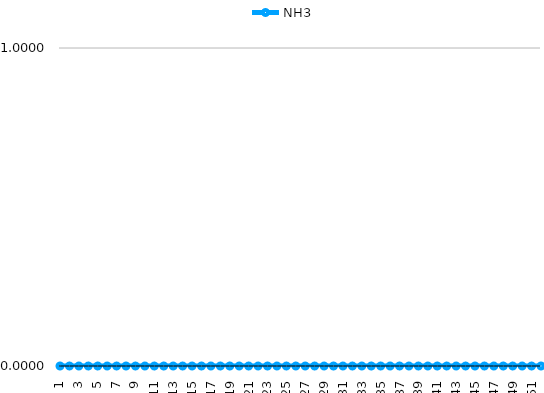
| Category | NH3 |
|---|---|
| 1 | 0 |
| 2 | 0 |
| 3 | 0 |
| 4 | 0 |
| 5 | 0 |
| 6 | 0 |
| 7 | 0 |
| 8 | 0 |
| 9 | 0 |
| 10 | 0 |
| 11 | 0 |
| 12 | 0 |
| 13 | 0 |
| 14 | 0 |
| 15 | 0 |
| 16 | 0 |
| 17 | 0 |
| 18 | 0 |
| 19 | 0 |
| 20 | 0 |
| 21 | 0 |
| 22 | 0 |
| 23 | 0 |
| 24 | 0 |
| 25 | 0 |
| 26 | 0 |
| 27 | 0 |
| 28 | 0 |
| 29 | 0 |
| 30 | 0 |
| 31 | 0 |
| 32 | 0 |
| 33 | 0 |
| 34 | 0 |
| 35 | 0 |
| 36 | 0 |
| 37 | 0 |
| 38 | 0 |
| 39 | 0 |
| 40 | 0 |
| 41 | 0 |
| 42 | 0 |
| 43 | 0 |
| 44 | 0 |
| 45 | 0 |
| 46 | 0 |
| 47 | 0 |
| 48 | 0 |
| 49 | 0 |
| 50 | 0 |
| 51 | 0 |
| 52 | 0 |